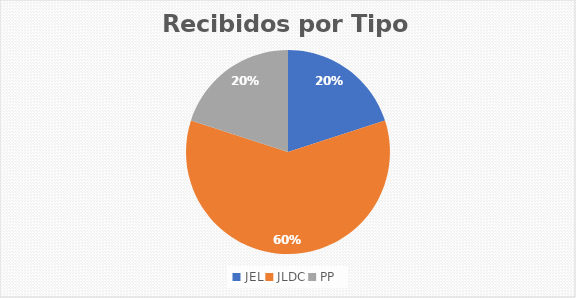
| Category | Series 0 |
|---|---|
| JEL | 2 |
| JLDC | 6 |
| PP | 2 |